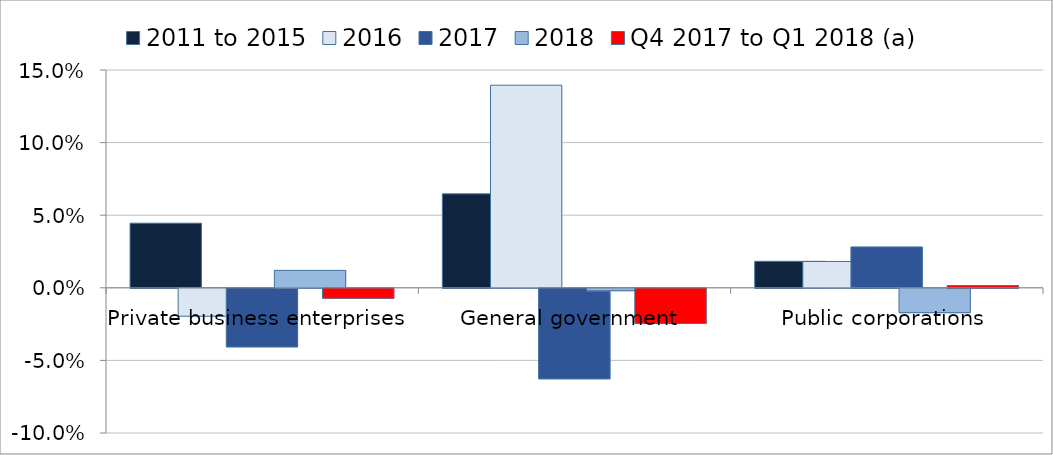
| Category | 2011 to 2015 | 2016 | 2017 | 2018 | Q4 2017 to Q1 2018 (a) |
|---|---|---|---|---|---|
| Private business enterprises | 0.044 | -0.019 | -0.04 | 0.012 | -0.007 |
| General government | 0.065 | 0.14 | -0.062 | -0.002 | -0.024 |
| Public corporations | 0.018 | 0.018 | 0.028 | -0.017 | 0.002 |